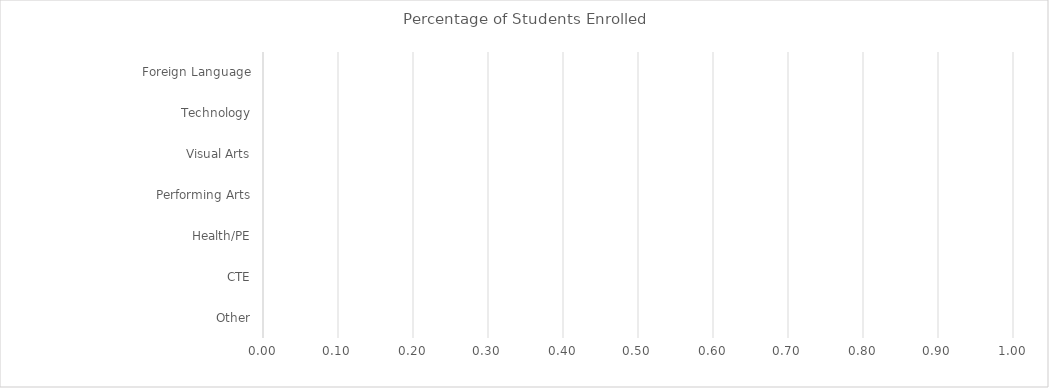
| Category | Benchmark | Entire LEA  | Title IV-A Identified Schools |
|---|---|---|---|
| Foreign Language | 0 | 0 | 0 |
| Technology | 0 | 0 | 0 |
| Visual Arts | 0 | 0 | 0 |
| Performing Arts | 0 | 0 | 0 |
| Health/PE | 0 | 0 | 0 |
| CTE | 0 | 0 | 0 |
| Other | 0 | 0 | 0 |